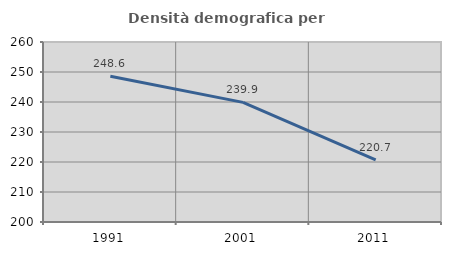
| Category | Densità demografica |
|---|---|
| 1991.0 | 248.587 |
| 2001.0 | 239.869 |
| 2011.0 | 220.726 |